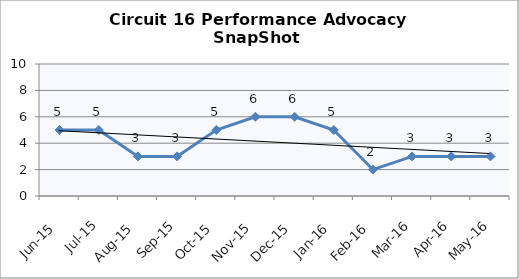
| Category | Circuit 16 |
|---|---|
| Jun-15 | 5 |
| Jul-15 | 5 |
| Aug-15 | 3 |
| Sep-15 | 3 |
| Oct-15 | 5 |
| Nov-15 | 6 |
| Dec-15 | 6 |
| Jan-16 | 5 |
| Feb-16 | 2 |
| Mar-16 | 3 |
| Apr-16 | 3 |
| May-16 | 3 |